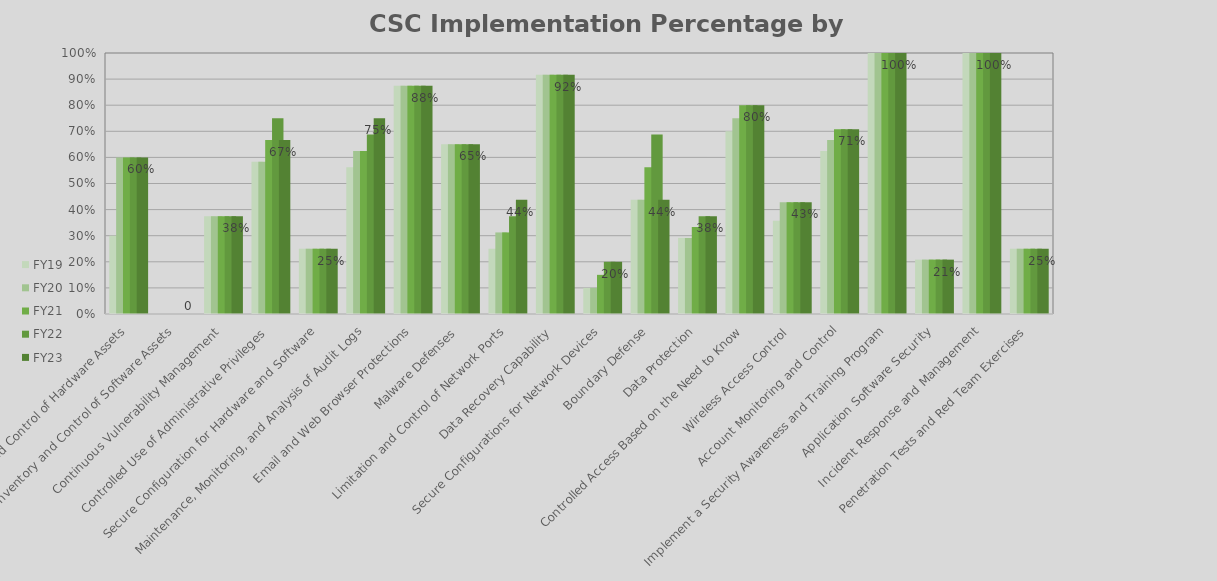
| Category | FY19 | FY20 | FY21 | FY22 | FY23 |
|---|---|---|---|---|---|
| Inventory and Control of Hardware Assets | 0.3 | 0.6 | 0.6 | 0.6 | 0.6 |
| Inventory and Control of Software Assets | 0 | 0 | 0 | 0 | 0 |
| Continuous Vulnerability Management | 0.375 | 0.375 | 0.375 | 0.375 | 0.375 |
| Controlled Use of Administrative Privileges | 0.583 | 0.583 | 0.667 | 0.75 | 0.667 |
| Secure Configuration for Hardware and Software | 0.25 | 0.25 | 0.25 | 0.25 | 0.25 |
| Maintenance, Monitoring, and Analysis of Audit Logs | 0.562 | 0.625 | 0.625 | 0.688 | 0.75 |
| Email and Web Browser Protections | 0.875 | 0.875 | 0.875 | 0.875 | 0.875 |
| Malware Defenses | 0.65 | 0.65 | 0.65 | 0.65 | 0.65 |
| Limitation and Control of Network Ports | 0.25 | 0.312 | 0.312 | 0.375 | 0.438 |
| Data Recovery Capability | 0.917 | 0.917 | 0.917 | 0.917 | 0.917 |
| Secure Configurations for Network Devices | 0.1 | 0.1 | 0.15 | 0.2 | 0.2 |
| Boundary Defense | 0.438 | 0.438 | 0.562 | 0.688 | 0.438 |
| Data Protection | 0.292 | 0.292 | 0.333 | 0.375 | 0.375 |
| Controlled Access Based on the Need to Know | 0.7 | 0.75 | 0.8 | 0.8 | 0.8 |
| Wireless Access Control | 0.357 | 0.429 | 0.429 | 0.429 | 0.429 |
| Account Monitoring and Control | 0.625 | 0.667 | 0.708 | 0.708 | 0.708 |
| Implement a Security Awareness and Training Program | 1 | 1 | 1 | 1 | 1 |
| Application Software Security | 0.208 | 0.208 | 0.208 | 0.208 | 0.208 |
| Incident Response and Management | 1 | 1 | 1 | 1 | 1 |
| Penetration Tests and Red Team Exercises | 0.25 | 0.25 | 0.25 | 0.25 | 0.25 |